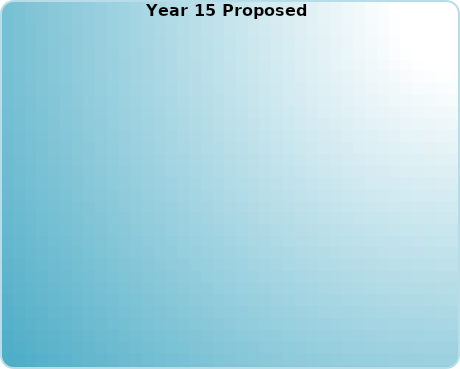
| Category | Series 0 |
|---|---|
| Cash Equivalents | 0 |
| U.S. Government (not agency) & Investment Grade U.S. Corporate Bonds | 0 |
| Municipal (federally tax-free) Bonds | 0 |
| High Yield, Int'l, Agency, Zero Coupon, and All Other Bonds | 0 |
| High to Medium Yield & Value Style Stocks (U.S. Large- & Mid-Cap) | 0 |
| Low to No Yield & Growth Style Stocks (U.S. Large- & Mid-Cap) | 0 |
| Int'l Stocks, Emerging Markets, & Other Int'l Equities | 0 |
| Small-Cap, Precious Metals, Sector Funds, Real Estate, LPs, Misc. Equities | 0 |